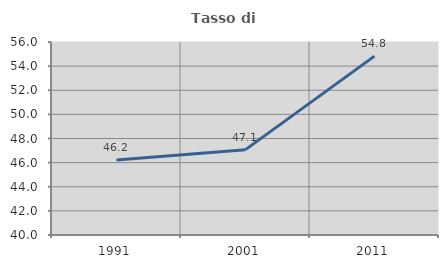
| Category | Tasso di occupazione   |
|---|---|
| 1991.0 | 46.226 |
| 2001.0 | 47.077 |
| 2011.0 | 54.83 |